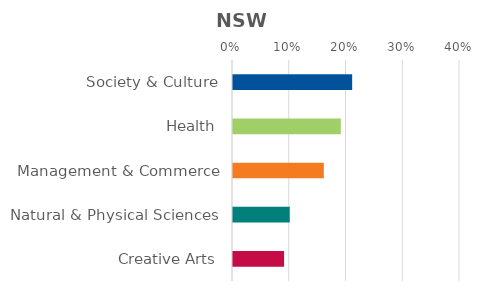
| Category | Series 0 |
|---|---|
| Society & Culture | 0.21 |
| Health | 0.19 |
| Management & Commerce | 0.16 |
| Natural & Physical Sciences | 0.1 |
| Creative Arts | 0.09 |